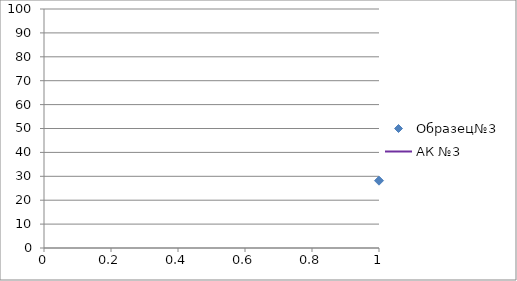
| Category | Образец№3 |
|---|---|
| 0 | 28.17 |
| 1 | 29.5 |
| 2 | 31.83 |
| 3 | 42.16 |
| 4 | 53.49 |
| 5 | 64.82 |
| 6 | 71.8 |
| 7 | 72.9 |
| 8 | 80.2 |
| 9 | 84.9 |
| 10 | 86.1 |
| 11 | 89.4 |
| 12 | 91.6 |
| 13 | 93.1 |
| 14 | 94.7 |
| 15 | 96.3 |
| 16 | 97.5 |
| 17 | 98.9 |
| 18 | 99.9 |